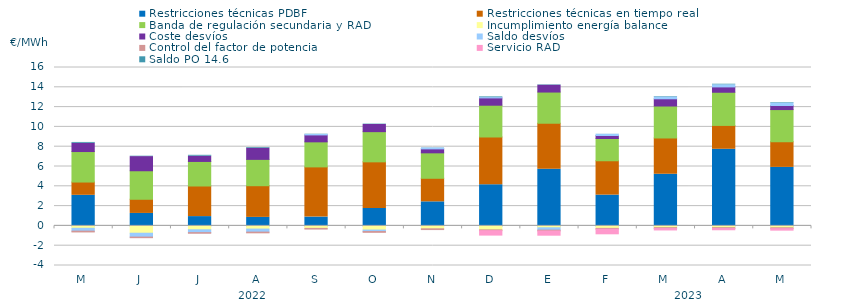
| Category | Restricciones técnicas PDBF | Restricciones técnicas en tiempo real | Banda de regulación secundaria y RAD | Incumplimiento energía balance | Coste desvíos | Saldo desvíos | Control del factor de potencia | Servicio RAD | Saldo PO 14.6 |
|---|---|---|---|---|---|---|---|---|---|
| M | 3.09 | 1.34 | 3.08 | -0.24 | 0.83 | -0.29 | -0.08 | 0 | 0.09 |
| J | 1.26 | 1.43 | 2.88 | -0.74 | 1.43 | -0.39 | -0.06 | 0 | 0.04 |
| J | 0.94 | 3.09 | 2.48 | -0.39 | 0.53 | -0.29 | -0.06 | 0 | 0.09 |
| A | 0.86 | 3.2 | 2.66 | -0.32 | 1.13 | -0.31 | -0.07 | 0 | 0.07 |
| S | 0.89 | 5.07 | 2.53 | -0.25 | 0.7 | 0.04 | -0.07 | 0 | 0.03 |
| O | 1.76 | 4.71 | 3.05 | -0.42 | 0.72 | -0.15 | -0.08 | 0 | 0.04 |
| N | 2.43 | 2.38 | 2.57 | -0.29 | 0.4 | 0.09 | -0.08 | 0 | 0.02 |
| D | 4.16 | 4.82 | 3.21 | -0.4 | 0.74 | 0.03 | -0.08 | -0.55 | 0.07 |
| E | 5.73 | 4.64 | 3.15 | -0.19 | 0.69 | -0.24 | -0.08 | -0.53 | 0.04 |
| F | 3.11 | 3.47 | 2.25 | -0.25 | 0.3 | 0.12 | -0.08 | -0.57 | 0.01 |
| M | 5.22 | 3.66 | 3.23 | -0.18 | 0.73 | 0.17 | -0.09 | -0.24 | 0.05 |
| A | 7.74 | 2.41 | 3.35 | -0.18 | 0.54 | 0.21 | -0.09 | -0.22 | 0.06 |
| M | 5.91 | 2.59 | 3.25 | -0.19 | 0.41 | 0.25 | -0.09 | -0.25 | 0.05 |